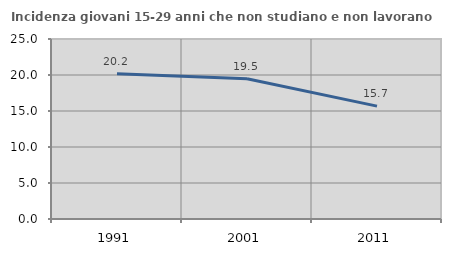
| Category | Incidenza giovani 15-29 anni che non studiano e non lavorano  |
|---|---|
| 1991.0 | 20.175 |
| 2001.0 | 19.484 |
| 2011.0 | 15.676 |